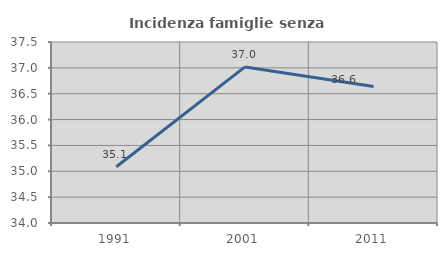
| Category | Incidenza famiglie senza nuclei |
|---|---|
| 1991.0 | 35.088 |
| 2001.0 | 37.018 |
| 2011.0 | 36.639 |